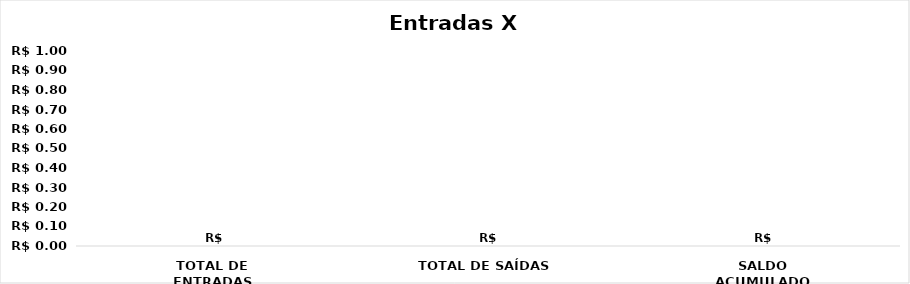
| Category | Series 0 |
|---|---|
| TOTAL DE ENTRADAS | 0 |
| TOTAL DE SAÍDAS | 0 |
| SALDO ACUMULADO | 0 |